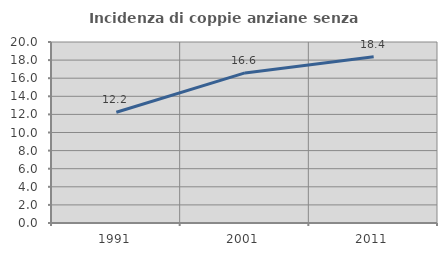
| Category | Incidenza di coppie anziane senza figli  |
|---|---|
| 1991.0 | 12.234 |
| 2001.0 | 16.585 |
| 2011.0 | 18.376 |